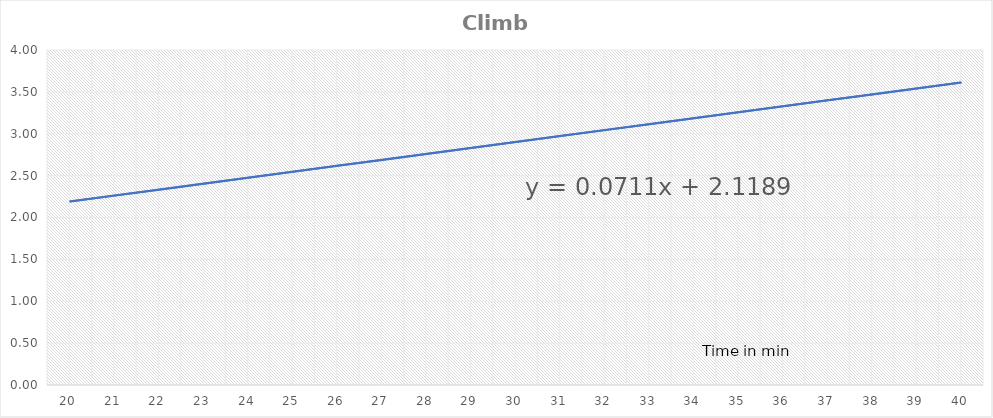
| Category | Climb adjustment |
|---|---|
| 20.0 | 2.19 |
| 21.0 | 2.261 |
| 22.0 | 2.332 |
| 23.0 | 2.403 |
| 24.0 | 2.474 |
| 25.0 | 2.545 |
| 26.0 | 2.617 |
| 27.0 | 2.688 |
| 28.0 | 2.759 |
| 29.0 | 2.83 |
| 30.0 | 2.901 |
| 31.0 | 2.972 |
| 32.0 | 3.043 |
| 33.0 | 3.114 |
| 34.0 | 3.185 |
| 35.0 | 3.256 |
| 36.0 | 3.328 |
| 37.0 | 3.399 |
| 38.0 | 3.47 |
| 39.0 | 3.541 |
| 40.0 | 3.612 |